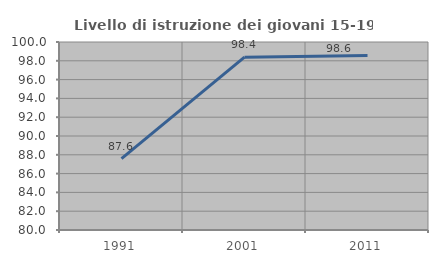
| Category | Livello di istruzione dei giovani 15-19 anni |
|---|---|
| 1991.0 | 87.586 |
| 2001.0 | 98.387 |
| 2011.0 | 98.551 |